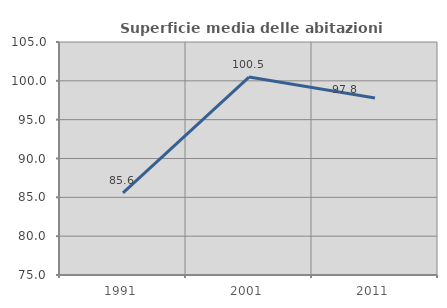
| Category | Superficie media delle abitazioni occupate |
|---|---|
| 1991.0 | 85.562 |
| 2001.0 | 100.489 |
| 2011.0 | 97.792 |